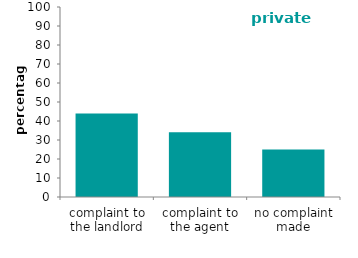
| Category | private renters |
|---|---|
| complaint to the landlord | 43.974 |
| complaint to the agent | 34.132 |
| no complaint made | 24.993 |